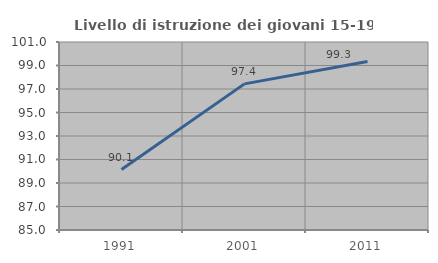
| Category | Livello di istruzione dei giovani 15-19 anni |
|---|---|
| 1991.0 | 90.143 |
| 2001.0 | 97.436 |
| 2011.0 | 99.346 |